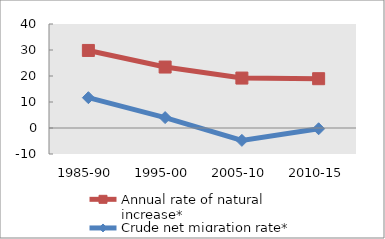
| Category | Annual rate of natural increase* | Crude net migration rate* |
|---|---|---|
| 1985-90 | 29.829 | 11.664 |
| 1995-00 | 23.449 | 3.997 |
| 2005-10 | 19.205 | -4.755 |
| 2010-15 | 18.965 | -0.292 |